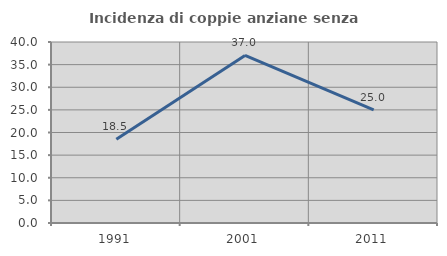
| Category | Incidenza di coppie anziane senza figli  |
|---|---|
| 1991.0 | 18.519 |
| 2001.0 | 37.037 |
| 2011.0 | 25 |